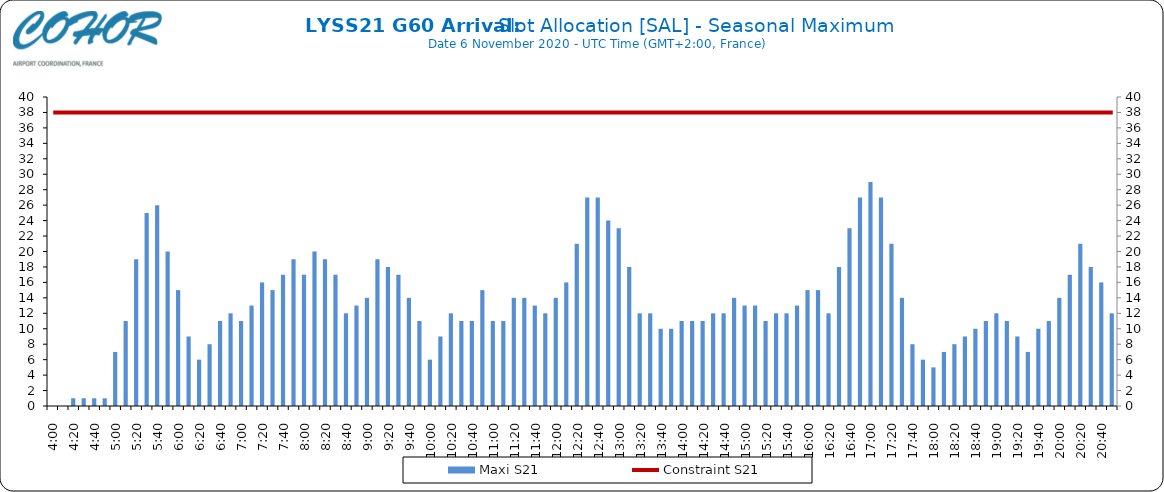
| Category | Maxi S21 |
|---|---|
| 0.16666666666666666 | 0 |
| 0.17361111111111113 | 0 |
| 0.18055555555555555 | 1 |
| 0.1875 | 1 |
| 0.19444444444444445 | 1 |
| 0.20138888888888887 | 1 |
| 0.20833333333333334 | 7 |
| 0.2152777777777778 | 11 |
| 0.2222222222222222 | 19 |
| 0.22916666666666666 | 25 |
| 0.23611111111111113 | 26 |
| 0.24305555555555555 | 20 |
| 0.25 | 15 |
| 0.2569444444444445 | 9 |
| 0.2638888888888889 | 6 |
| 0.2708333333333333 | 8 |
| 0.2777777777777778 | 11 |
| 0.2847222222222222 | 12 |
| 0.2916666666666667 | 11 |
| 0.2986111111111111 | 13 |
| 0.3055555555555555 | 16 |
| 0.3125 | 15 |
| 0.3194444444444445 | 17 |
| 0.3263888888888889 | 19 |
| 0.3333333333333333 | 17 |
| 0.34027777777777773 | 20 |
| 0.34722222222222227 | 19 |
| 0.3541666666666667 | 17 |
| 0.3611111111111111 | 12 |
| 0.3680555555555556 | 13 |
| 0.375 | 14 |
| 0.3819444444444444 | 19 |
| 0.3888888888888889 | 18 |
| 0.3958333333333333 | 17 |
| 0.40277777777777773 | 14 |
| 0.40972222222222227 | 11 |
| 0.4166666666666667 | 6 |
| 0.4236111111111111 | 9 |
| 0.4305555555555556 | 12 |
| 0.4375 | 11 |
| 0.4444444444444444 | 11 |
| 0.4513888888888889 | 15 |
| 0.4583333333333333 | 11 |
| 0.46527777777777773 | 11 |
| 0.47222222222222227 | 14 |
| 0.4791666666666667 | 14 |
| 0.4861111111111111 | 13 |
| 0.4930555555555556 | 12 |
| 0.5 | 14 |
| 0.5069444444444444 | 16 |
| 0.513888888888889 | 21 |
| 0.5208333333333334 | 27 |
| 0.5277777777777778 | 27 |
| 0.5347222222222222 | 24 |
| 0.5416666666666666 | 23 |
| 0.548611111111111 | 18 |
| 0.5555555555555556 | 12 |
| 0.5625 | 12 |
| 0.5694444444444444 | 10 |
| 0.576388888888889 | 10 |
| 0.5833333333333334 | 11 |
| 0.5902777777777778 | 11 |
| 0.5972222222222222 | 11 |
| 0.6041666666666666 | 12 |
| 0.611111111111111 | 12 |
| 0.6180555555555556 | 14 |
| 0.625 | 13 |
| 0.6319444444444444 | 13 |
| 0.638888888888889 | 11 |
| 0.6458333333333334 | 12 |
| 0.6527777777777778 | 12 |
| 0.6597222222222222 | 13 |
| 0.6666666666666666 | 15 |
| 0.6736111111111112 | 15 |
| 0.6805555555555555 | 12 |
| 0.6875 | 18 |
| 0.6944444444444445 | 23 |
| 0.7013888888888888 | 27 |
| 0.7083333333333334 | 29 |
| 0.7152777777777778 | 27 |
| 0.7222222222222222 | 21 |
| 0.7291666666666666 | 14 |
| 0.7361111111111112 | 8 |
| 0.7430555555555555 | 6 |
| 0.75 | 5 |
| 0.7569444444444445 | 7 |
| 0.7638888888888888 | 8 |
| 0.7708333333333334 | 9 |
| 0.7777777777777778 | 10 |
| 0.7847222222222222 | 11 |
| 0.7916666666666666 | 12 |
| 0.7986111111111112 | 11 |
| 0.8055555555555555 | 9 |
| 0.8125 | 7 |
| 0.8194444444444445 | 10 |
| 0.8263888888888888 | 11 |
| 0.8333333333333334 | 14 |
| 0.8402777777777778 | 17 |
| 0.8472222222222222 | 21 |
| 0.8541666666666666 | 18 |
| 0.8611111111111112 | 16 |
| 0.8680555555555555 | 12 |